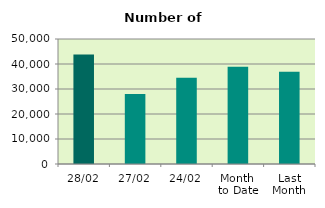
| Category | Series 0 |
|---|---|
| 28/02 | 43804 |
| 27/02 | 28030 |
| 24/02 | 34546 |
| Month 
to Date | 38877.2 |
| Last
Month | 36886.364 |